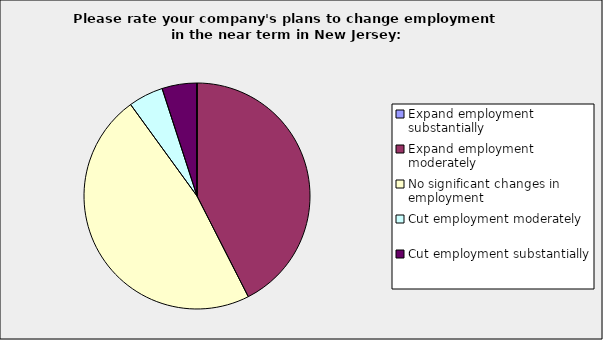
| Category | Series 0 |
|---|---|
| Expand employment substantially | 0 |
| Expand employment moderately | 0.425 |
| No significant changes in employment | 0.475 |
| Cut employment moderately | 0.05 |
| Cut employment substantially | 0.05 |